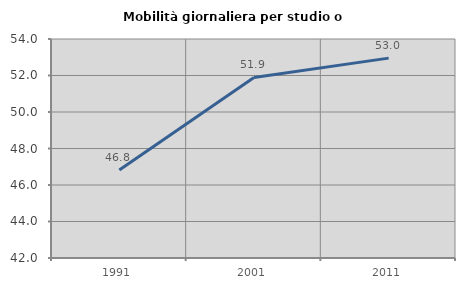
| Category | Mobilità giornaliera per studio o lavoro |
|---|---|
| 1991.0 | 46.819 |
| 2001.0 | 51.892 |
| 2011.0 | 52.951 |